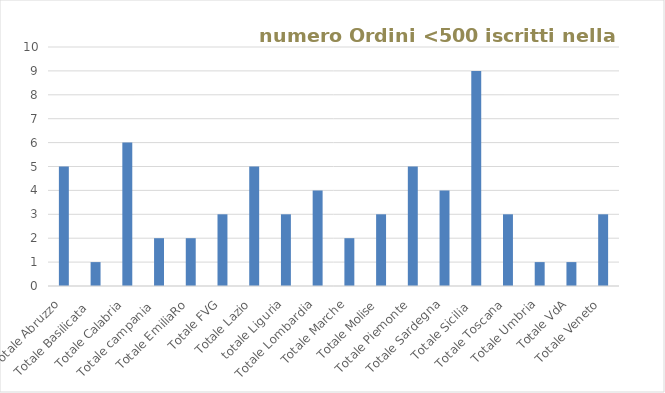
| Category | Series 0 |
|---|---|
| Totale Abruzzo | 5 |
| Totale Basilicata  | 1 |
| Totale Calabria | 6 |
| Totale campania  | 2 |
| Totale EmiliaRo | 2 |
| Totale FVG | 3 |
| Totale Lazio | 5 |
| totale Liguria | 3 |
| Totale Lombardia | 4 |
| Totale Marche | 2 |
| Totale Molise | 3 |
| Totale Piemonte | 5 |
| Totale Sardegna | 4 |
| Totale Sicilia  | 9 |
| Totale Toscana | 3 |
| Totale Umbria | 1 |
| Totale VdA | 1 |
| Totale Veneto | 3 |